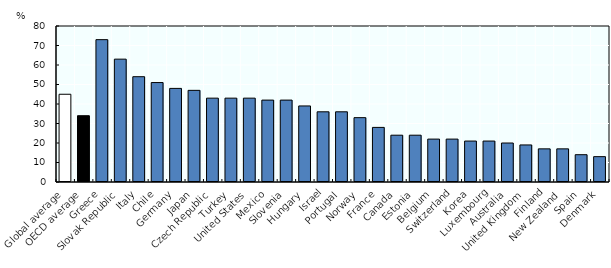
| Category | Series 0 |
|---|---|
| Global average | 45 |
| OECD average | 34 |
| Greece | 73 |
| Slovak Republic | 63 |
| Italy | 54 |
| Chile | 51 |
| Germany | 48 |
| Japan | 47 |
| Czech Republic | 43 |
| Turkey | 43 |
| United States | 43 |
| Mexico | 42 |
| Slovenia | 42 |
| Hungary | 39 |
| Israel | 36 |
| Portugal | 36 |
| Norway | 33 |
| France | 28 |
| Canada | 24 |
| Estonia | 24 |
| Belgium | 22 |
| Switzerland | 22 |
| Korea | 21 |
| Luxembourg | 21 |
| Australia | 20 |
| United Kingdom | 19 |
| Finland | 17 |
| New Zealand | 17 |
| Spain | 14 |
| Denmark | 13 |